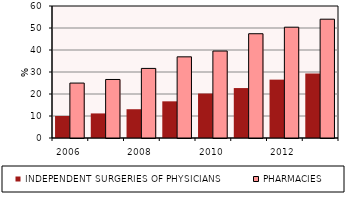
| Category | INDEPENDENT SURGERIES OF PHYSICIANS | PHARMACIES |
|---|---|---|
| 2006.0 | 9.992 | 24.965 |
| 2007.0 | 11.172 | 26.605 |
| 2008.0 | 13.077 | 31.628 |
| 2009.0 | 16.67 | 36.891 |
| 2010.0 | 20.214 | 39.537 |
| 2011.0 | 22.7 | 47.4 |
| 2012.0 | 26.53 | 50.363 |
| 2013.0 | 29.3 | 54 |